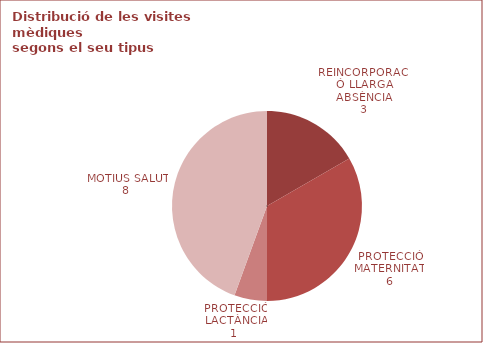
| Category |  TOTAL |
|---|---|
| 0 | 3 |
| 1 | 6 |
| 2 | 1 |
| 3 | 8 |